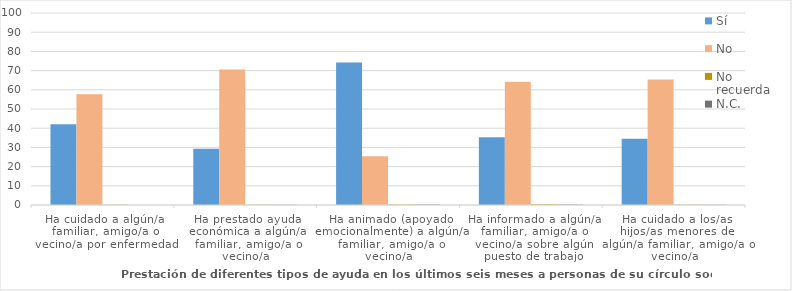
| Category | Sí | No | No recuerda | N.C. |
|---|---|---|---|---|
| Ha cuidado a algún/a familiar, amigo/a o vecino/a por enfermedad | 42.1 | 57.7 | 0.1 | 0 |
| Ha prestado ayuda económica a algún/a familiar, amigo/a o vecino/a | 29.3 | 70.6 | 0.1 | 0.1 |
| Ha animado (apoyado emocionalmente) a algún/a familiar, amigo/a o vecino/a | 74.2 | 25.4 | 0.2 | 0.2 |
| Ha informado a algún/a familiar, amigo/a o vecino/a sobre algún puesto de trabajo | 35.3 | 64.2 | 0.3 | 0.2 |
| Ha cuidado a los/as hijos/as menores de algún/a familiar, amigo/a o vecino/a | 34.5 | 65.3 | 0.1 | 0.1 |